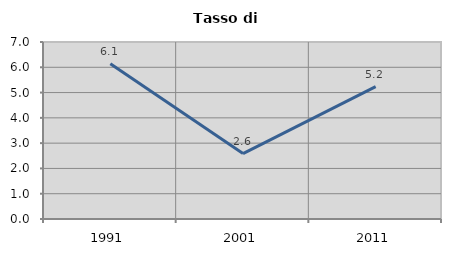
| Category | Tasso di disoccupazione   |
|---|---|
| 1991.0 | 6.136 |
| 2001.0 | 2.586 |
| 2011.0 | 5.236 |